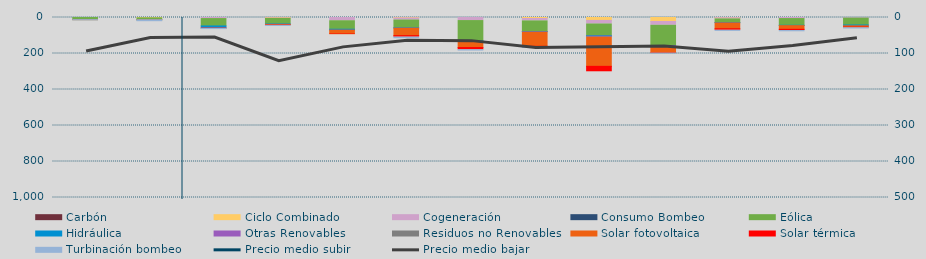
| Category | Carbón | Ciclo Combinado | Cogeneración | Consumo Bombeo | Eólica | Hidráulica | Otras Renovables | Residuos no Renovables | Solar fotovoltaica | Solar térmica | Turbinación bombeo |
|---|---|---|---|---|---|---|---|---|---|---|---|
| 0 | 0 | 0 | 195.2 | 0 | 11271.7 | 31.8 | 43.5 | 0 | 327.2 | 72.2 | 190.9 |
| 1 | 0 | 1594 | 466.5 | 0 | 10201.8 | 124.4 | 68.4 | 0 | 144.3 | 50.3 | 5089.6 |
| 2 | 0 | 0 | 5902.2 | 0 | 40924.6 | 10096 | 2210.8 | 541.2 | 397.2 | 861 | 700 |
| 3 | 0 | 2180.9 | 2937.8 | 0 | 30839.8 | 1899.6 | 565.6 | 0 | 1849.2 | 2802 | 1100 |
| 4 | 0 | 0 | 18046.2 | 0 | 47159 | 4513.5 | 523.7 | 0 | 19900.6 | 2658.1 | 0 |
| 5 | 0 | 2280 | 11810.8 | 0 | 43127.1 | 1164.1 | 1123.7 | 0 | 41530.2 | 8077.8 | 3040.7 |
| 6 | 0 | 0 | 17047.5 | 0 | 112869.5 | 3513.3 | 2033.2 | 0 | 31386.8 | 12440.9 | 1549.6 |
| 7 | 0 | 5564.7 | 13323.5 | 0 | 59321.6 | 487.1 | 2690.6 | 340 | 78205.9 | 6474.7 | 234.9 |
| 8 | 0 | 16258.4 | 19750 | 0 | 65114.4 | 2681.9 | 4946 | 396 | 162175.4 | 30259.6 | 0 |
| 9 | 0 | 22358.6 | 20882.5 | 0 | 113586.9 | 821.8 | 5978.7 | 1618 | 30024.6 | 2441 | 100 |
| 10 | 0 | 1223.5 | 6632.4 | 0 | 20209.7 | 842.9 | 1487.4 | 0 | 32267.6 | 8109.1 | 800 |
| 11 | 0 | 0 | 5876.6 | 0 | 37380.1 | 1248.7 | 505.5 | 224 | 20420.3 | 6894.4 | 1200 |
| 12 | 0 | 0 | 3323.3 | 0 | 38286.4 | 4248.1 | 635 | 0 | 7180.3 | 3217.4 | 1419.5 |